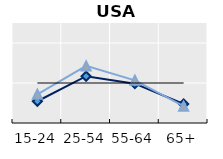
| Category | Né à l'étranger | Né dans le pays | Series 1 |
|---|---|---|---|
| 15-24 | 0.544 | 0.717 | 1 |
| 25-54 | 1.169 | 1.427 | 1 |
| 55-64 | 0.983 | 1.067 | 1 |
| 65+ | 0.475 | 0.42 | 1 |